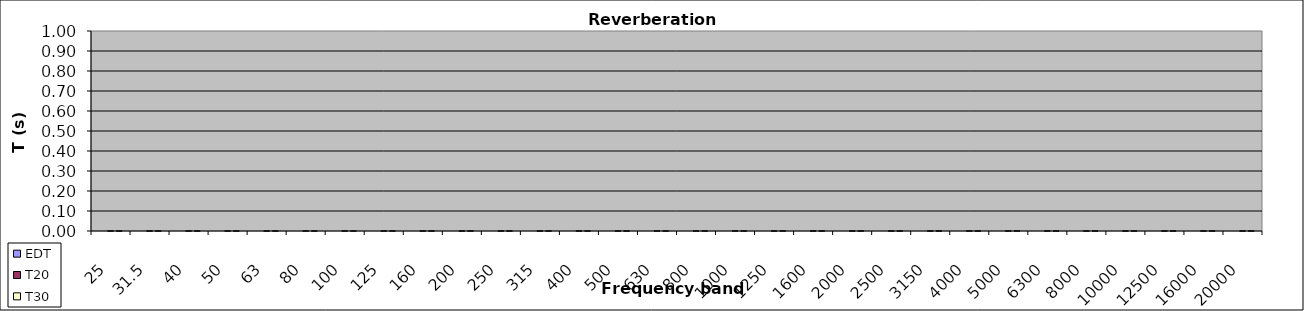
| Category | EDT | T20 | T30 |
|---|---|---|---|
| 25.0 | 0 | 0 | 0 |
| 31.5 | 0 | 0 | 0 |
| 40.0 | 0 | 0 | 0 |
| 50.0 | 0 | 0 | 0 |
| 63.0 | 0 | 0 | 0 |
| 80.0 | 0 | 0 | 0 |
| 100.0 | 0 | 0 | 0 |
| 125.0 | 0 | 0 | 0 |
| 160.0 | 0 | 0 | 0 |
| 200.0 | 0 | 0 | 0 |
| 250.0 | 0 | 0 | 0 |
| 315.0 | 0 | 0 | 0 |
| 400.0 | 0 | 0 | 0 |
| 500.0 | 0 | 0 | 0 |
| 630.0 | 0 | 0 | 0 |
| 800.0 | 0 | 0 | 0 |
| 1000.0 | 0 | 0 | 0 |
| 1250.0 | 0 | 0 | 0 |
| 1600.0 | 0 | 0 | 0 |
| 2000.0 | 0 | 0 | 0 |
| 2500.0 | 0 | 0 | 0 |
| 3150.0 | 0 | 0 | 0 |
| 4000.0 | 0 | 0 | 0 |
| 5000.0 | 0 | 0 | 0 |
| 6300.0 | 0 | 0 | 0 |
| 8000.0 | 0 | 0 | 0 |
| 10000.0 | 0 | 0 | 0 |
| 12500.0 | 0 | 0 | 0 |
| 16000.0 | 0 | 0 | 0 |
| 20000.0 | 0 | 0 | 0 |